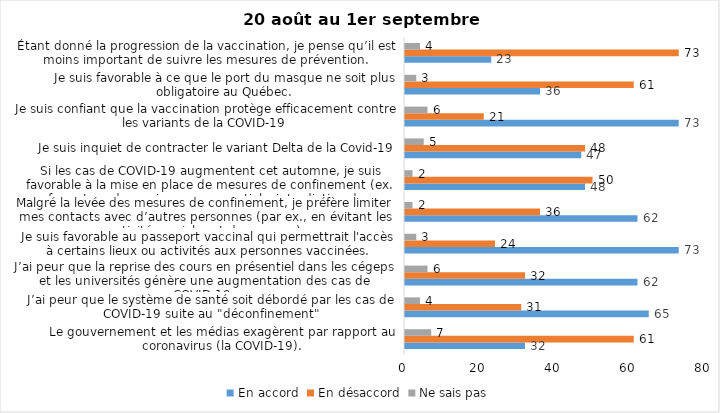
| Category | En accord | En désaccord | Ne sais pas |
|---|---|---|---|
| Le gouvernement et les médias exagèrent par rapport au coronavirus (la COVID-19). | 32 | 61 | 7 |
| J’ai peur que le système de santé soit débordé par les cas de COVID-19 suite au "déconfinement" | 65 | 31 | 4 |
| J’ai peur que la reprise des cours en présentiel dans les cégeps et les universités génère une augmentation des cas de COVID-19. | 62 | 32 | 6 |
| Je suis favorable au passeport vaccinal qui permettrait l'accès à certains lieux ou activités aux personnes vaccinées. | 73 | 24 | 3 |
| Malgré la levée des mesures de confinement, je préfère limiter mes contacts avec d’autres personnes (par ex., en évitant les activités sociales et de groupes) | 62 | 36 | 2 |
| Si les cas de COVID-19 augmentent cet automne, je suis favorable à la mise en place de mesures de confinement (ex. fermeture de services non essentiels, interdiction des rassemblements privés) | 48 | 50 | 2 |
| Je suis inquiet de contracter le variant Delta de la Covid-19 | 47 | 48 | 5 |
| Je suis confiant que la vaccination protège efficacement contre les variants de la COVID-19 | 73 | 21 | 6 |
| Je suis favorable à ce que le port du masque ne soit plus obligatoire au Québec. | 36 | 61 | 3 |
| Étant donné la progression de la vaccination, je pense qu’il est moins important de suivre les mesures de prévention. | 23 | 73 | 4 |